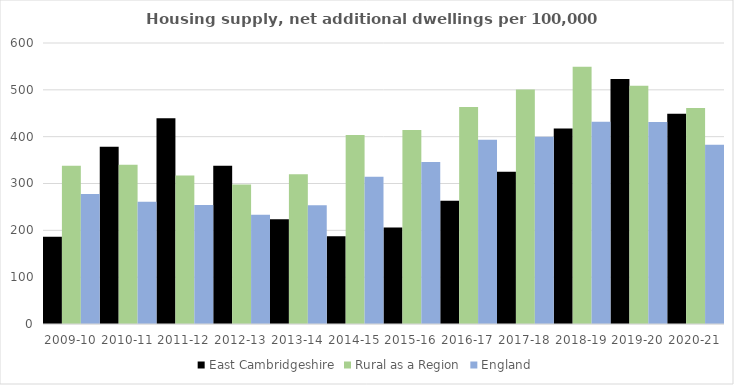
| Category | East Cambridgeshire | Rural as a Region | England |
|---|---|---|---|
| 2009-10 | 186.262 | 337.852 | 277.548 |
| 2010-11 | 378.618 | 340.105 | 260.994 |
| 2011-12 | 439.195 | 317.04 | 254.007 |
| 2012-13 | 337.949 | 297.763 | 233.153 |
| 2013-14 | 223.406 | 319.835 | 253.602 |
| 2014-15 | 187.259 | 403.796 | 314.256 |
| 2015-16 | 206.19 | 414.091 | 346.154 |
| 2016-17 | 263.071 | 463.209 | 393.256 |
| 2017-18 | 325.238 | 500.68 | 399.646 |
| 2018-19 | 417.403 | 549.491 | 432.099 |
| 2019-20 | 523.152 | 508.493 | 431.187 |
| 2020-21 | 449.142 | 461.114 | 382.827 |